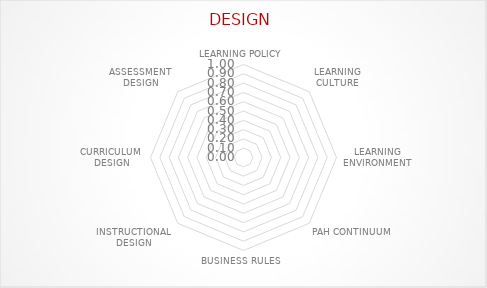
| Category | Series 0 |
|---|---|
| LEARNING POLICY | 0 |
| LEARNING CULTURE | 0 |
| LEARNING ENVIRONMENT | 0 |
| PAH CONTINUUM | 0 |
| BUSINESS RULES | 0 |
| INSTRUCTIONAL DESIGN | 0 |
| CURRICULUM DESIGN | 0 |
| ASSESSMENT DESIGN | 0 |